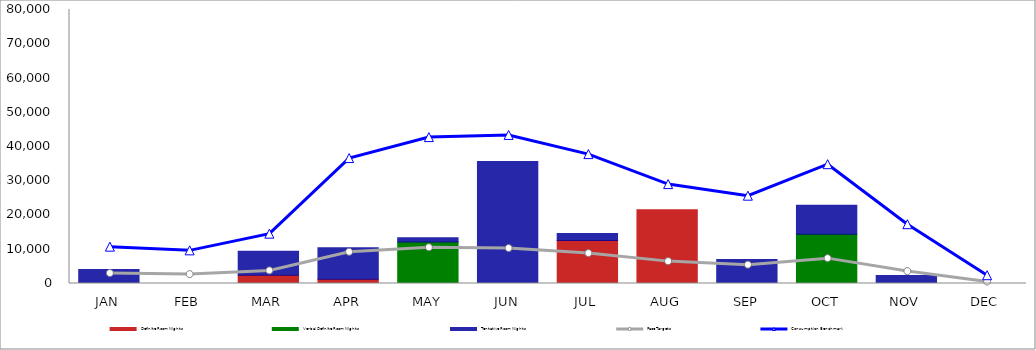
| Category | Definite Room Nights | Verbal Definite Room Nights | Tentative Room Nights |
|---|---|---|---|
| JAN | 0 | 0 | 4088 |
| FEB | 0 | 0 | 0 |
| MAR | 2400 | 0 | 7000 |
| APR | 1205 | 0 | 9239 |
| MAY | 0 | 12090 | 1295 |
| JUN | 0 | 0 | 35595 |
| JUL | 12546 | 0 | 2038 |
| AUG | 21550 | 0 | 0 |
| SEP | 0 | 0 | 6998 |
| OCT | 0 | 14355 | 8462 |
| NOV | 0 | 0 | 2316 |
| DEC | 0 | 0 | 0 |